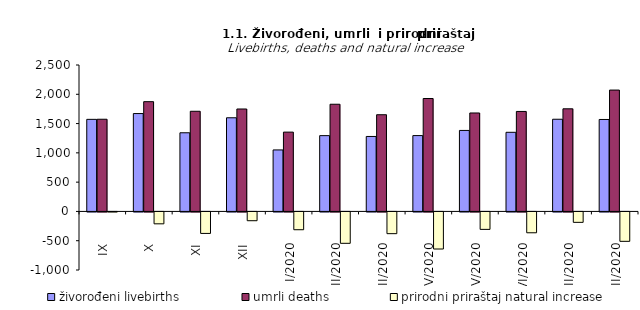
| Category | živorođeni livebirths | umrli deaths | prirodni priraštaj natural increase |
|---|---|---|---|
| IX | 1572 | 1574 | -2 |
| X | 1671 | 1874 | -203 |
| XI | 1343 | 1710 | -367 |
| XII | 1599 | 1749 | -150 |
| I/2020 | 1050 | 1354 | -304 |
| II/2020 | 1294 | 1830 | -536 |
| III/2020 | 1280 | 1651 | -371 |
| IV/2020 | 1295 | 1928 | -633 |
| V/2020 | 1383 | 1681 | -298 |
| VI/2020 | 1351 | 1707 | -356 |
| VII/2020 | 1574 | 1752 | -178 |
| VIII/2020 | 1570 | 2072 | -502 |